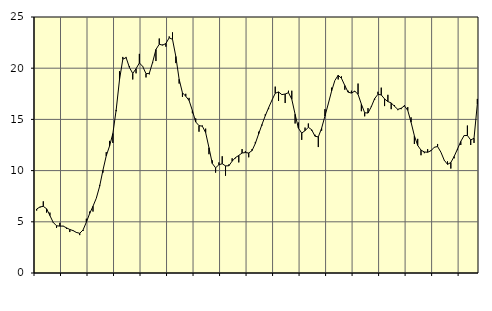
| Category | Piggar | Series 1 |
|---|---|---|
| nan | 6.1 | 6.25 |
| 87.0 | 6.4 | 6.45 |
| 87.0 | 7 | 6.51 |
| 87.0 | 5.9 | 6.27 |
| nan | 5.9 | 5.61 |
| 88.0 | 4.9 | 4.94 |
| 88.0 | 4.4 | 4.61 |
| 88.0 | 4.9 | 4.58 |
| nan | 4.6 | 4.58 |
| 89.0 | 4.3 | 4.41 |
| 89.0 | 4 | 4.25 |
| 89.0 | 4.1 | 4.14 |
| nan | 4 | 3.96 |
| 90.0 | 3.7 | 3.88 |
| 90.0 | 4.1 | 4.2 |
| 90.0 | 5.3 | 4.96 |
| nan | 6 | 5.81 |
| 91.0 | 6 | 6.52 |
| 91.0 | 7.3 | 7.3 |
| 91.0 | 8.6 | 8.46 |
| nan | 9.8 | 10.03 |
| 92.0 | 11.8 | 11.44 |
| 92.0 | 12.9 | 12.4 |
| 92.0 | 12.7 | 13.62 |
| nan | 15.8 | 15.93 |
| 93.0 | 19.7 | 18.86 |
| 93.0 | 21.1 | 20.88 |
| 93.0 | 21.1 | 21.03 |
| nan | 20.2 | 20.07 |
| 94.0 | 18.9 | 19.49 |
| 94.0 | 19.5 | 19.95 |
| 94.0 | 21.4 | 20.51 |
| nan | 20.2 | 20.18 |
| 95.0 | 19.1 | 19.46 |
| 95.0 | 19.4 | 19.5 |
| 95.0 | 20.5 | 20.58 |
| nan | 20.7 | 21.83 |
| 96.0 | 22.9 | 22.34 |
| 96.0 | 22.3 | 22.25 |
| 96.0 | 22.1 | 22.41 |
| nan | 23.1 | 22.97 |
| 97.0 | 23.5 | 22.82 |
| 97.0 | 20.5 | 21.15 |
| 97.0 | 18.5 | 18.92 |
| nan | 17.2 | 17.6 |
| 98.0 | 17.5 | 17.26 |
| 98.0 | 17.1 | 16.85 |
| 98.0 | 15.6 | 15.87 |
| nan | 15.1 | 14.75 |
| 99.0 | 13.8 | 14.39 |
| 99.0 | 14.4 | 14.34 |
| 99.0 | 14.1 | 13.71 |
| nan | 11.6 | 12.24 |
| 0.0 | 11 | 10.7 |
| 0.0 | 9.8 | 10.27 |
| 0.0 | 10.8 | 10.57 |
| nan | 11.4 | 10.67 |
| 1.0 | 9.5 | 10.46 |
| 1.0 | 10.6 | 10.47 |
| 1.0 | 11.2 | 10.92 |
| nan | 11.2 | 11.27 |
| 2.0 | 10.8 | 11.48 |
| 2.0 | 12.1 | 11.72 |
| 2.0 | 11.9 | 11.76 |
| nan | 11.3 | 11.72 |
| 3.0 | 12.1 | 11.95 |
| 3.0 | 12.8 | 12.65 |
| 3.0 | 13.8 | 13.59 |
| nan | 14.4 | 14.5 |
| 4.0 | 15.5 | 15.36 |
| 4.0 | 16 | 16.14 |
| 4.0 | 16.9 | 16.87 |
| nan | 18.2 | 17.55 |
| 5.0 | 16.8 | 17.68 |
| 5.0 | 17.4 | 17.42 |
| 5.0 | 16.6 | 17.48 |
| nan | 17.8 | 17.61 |
| 6.0 | 17.8 | 16.97 |
| 6.0 | 14.6 | 15.5 |
| 6.0 | 14.7 | 14.14 |
| nan | 13 | 13.66 |
| 7.0 | 14.2 | 13.9 |
| 7.0 | 14.6 | 14.23 |
| 7.0 | 13.9 | 13.99 |
| nan | 13.5 | 13.36 |
| 8.0 | 12.3 | 13.29 |
| 8.0 | 13.9 | 14.14 |
| 8.0 | 16 | 15.32 |
| nan | 16.5 | 16.51 |
| 9.0 | 18.1 | 17.75 |
| 9.0 | 18.8 | 18.8 |
| 9.0 | 18.9 | 19.31 |
| nan | 19.2 | 19.01 |
| 10.0 | 17.9 | 18.31 |
| 10.0 | 17.8 | 17.66 |
| 10.0 | 17.8 | 17.57 |
| nan | 17.7 | 17.76 |
| 11.0 | 18.5 | 17.45 |
| 11.0 | 15.8 | 16.49 |
| 11.0 | 15.3 | 15.65 |
| nan | 16.1 | 15.62 |
| 12.0 | 16.3 | 16.24 |
| 12.0 | 16.9 | 17.03 |
| 12.0 | 17.7 | 17.45 |
| nan | 18.1 | 17.39 |
| 13.0 | 16.3 | 17 |
| 13.0 | 17.4 | 16.74 |
| 13.0 | 16 | 16.61 |
| nan | 16.4 | 16.28 |
| 14.0 | 15.9 | 15.98 |
| 14.0 | 16 | 16.09 |
| 14.0 | 16.4 | 16.32 |
| nan | 16.2 | 15.88 |
| 15.0 | 15.2 | 14.72 |
| 15.0 | 12.6 | 13.4 |
| 15.0 | 13.1 | 12.46 |
| nan | 11.5 | 12 |
| 16.0 | 11.7 | 11.82 |
| 16.0 | 12.1 | 11.79 |
| 16.0 | 12 | 11.94 |
| nan | 12.3 | 12.28 |
| 17.0 | 12.6 | 12.35 |
| 17.0 | 11.8 | 11.8 |
| 17.0 | 11 | 11.02 |
| nan | 10.9 | 10.61 |
| 18.0 | 10.2 | 10.79 |
| 18.0 | 11.2 | 11.38 |
| 18.0 | 12 | 12.1 |
| nan | 12.5 | 12.85 |
| 19.0 | 13.4 | 13.42 |
| 19.0 | 14.4 | 13.43 |
| 19.0 | 12.5 | 12.99 |
| nan | 12.7 | 13.16 |
| 20.0 | 17 | 16.5 |